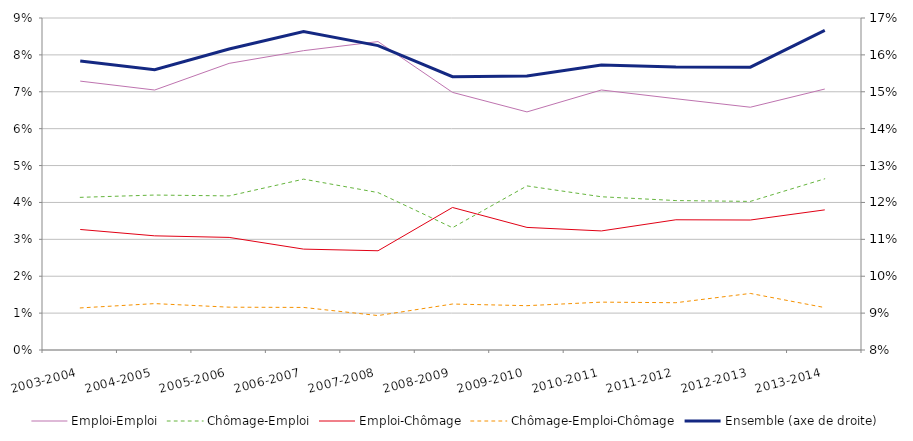
| Category | Emploi-Emploi | Chômage-Emploi | Emploi-Chômage | Chômage-Emploi-Chômage |
|---|---|---|---|---|
| 2003-2004 | 0.073 | 0.041 | 0.033 | 0.011 |
| 2004-2005 | 0.07 | 0.042 | 0.031 | 0.013 |
| 2005-2006 | 0.078 | 0.042 | 0.031 | 0.012 |
| 2006-2007 | 0.081 | 0.046 | 0.027 | 0.012 |
| 2007-2008 | 0.084 | 0.043 | 0.027 | 0.009 |
| 2008-2009 | 0.07 | 0.033 | 0.039 | 0.012 |
| 2009-2010 | 0.065 | 0.044 | 0.033 | 0.012 |
| 2010-2011 | 0.07 | 0.042 | 0.032 | 0.013 |
| 2011-2012 | 0.068 | 0.041 | 0.035 | 0.013 |
| 2012-2013 | 0.066 | 0.04 | 0.035 | 0.015 |
| 2013-2014 | 0.071 | 0.046 | 0.038 | 0.012 |